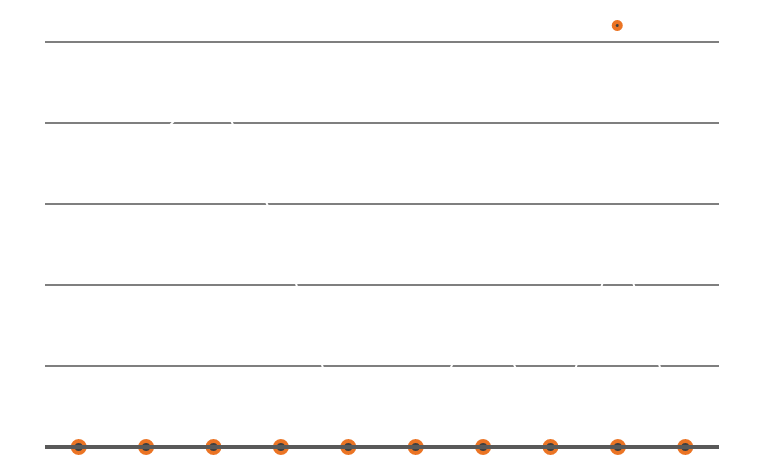
| Category | Gefahrene Kilometer |
|---|---|
| 5/1/12 | 162 |
| 5/2/12 | 183 |
| 5/3/12 | 227 |
| 5/4/12 | 130 |
| 5/5/12 | 0 |
| 5/6/12 | 0 |
| 5/7/12 | 94 |
| 5/8/12 | 0 |
| 5/9/12 | 131 |
| 5/10/12 | 0 |